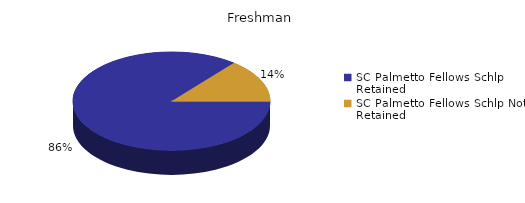
| Category | Freshman |
|---|---|
| SC Palmetto Fellows Schlp Retained  | 316 |
| SC Palmetto Fellows Schlp Not Retained  | 52 |